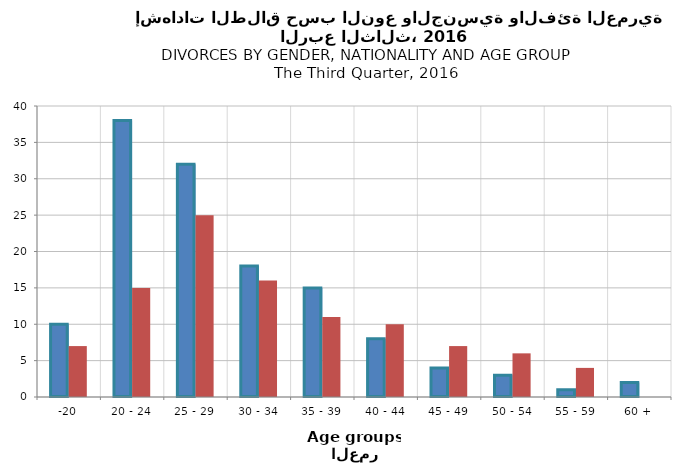
| Category | إناث قطريات
Qatari Females | إناث غير قطريات
Non-Qatari Females |
|---|---|---|
| -20 | 10 | 7 |
| 20 - 24 | 38 | 15 |
| 25 - 29 | 32 | 25 |
| 30 - 34 | 18 | 16 |
| 35 - 39 | 15 | 11 |
| 40 - 44 | 8 | 10 |
| 45 - 49 | 4 | 7 |
| 50 - 54 | 3 | 6 |
| 55 - 59 | 1 | 4 |
| 60 + | 2 | 0 |